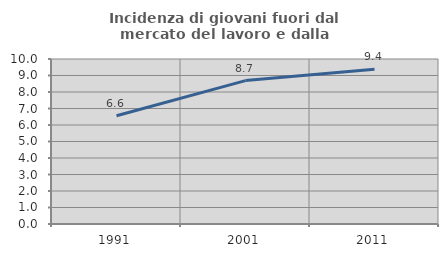
| Category | Incidenza di giovani fuori dal mercato del lavoro e dalla formazione  |
|---|---|
| 1991.0 | 6.558 |
| 2001.0 | 8.691 |
| 2011.0 | 9.382 |